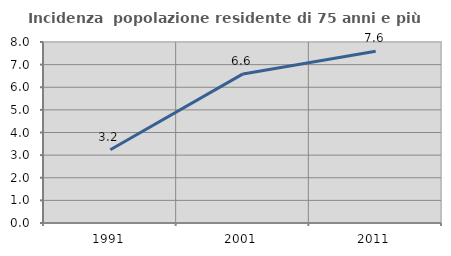
| Category | Incidenza  popolazione residente di 75 anni e più |
|---|---|
| 1991.0 | 3.238 |
| 2001.0 | 6.59 |
| 2011.0 | 7.593 |